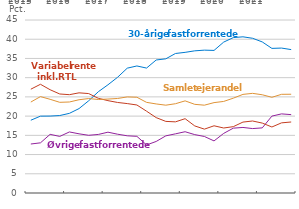
| Category | 30-årige fastforrentede | Øvrige fastforrentede | Variabel rente inkl. RTL | Samlet ejerandel |
|---|---|---|---|---|
| 2015.0 | 18.932 | 12.742 | 27.001 | 23.654 |
| nan | 19.99 | 13.047 | 28.278 | 25.077 |
| nan | 20.009 | 15.256 | 26.861 | 24.373 |
| nan | 20.149 | 14.717 | 25.754 | 23.587 |
| 2016.0 | 20.718 | 15.88 | 25.573 | 23.673 |
| nan | 21.959 | 15.394 | 26.056 | 24.259 |
| nan | 23.988 | 15.008 | 25.863 | 24.568 |
| nan | 26.342 | 15.231 | 24.635 | 24.328 |
| 2017.0 | 28.148 | 15.819 | 24.023 | 24.433 |
| nan | 30.104 | 15.29 | 23.551 | 24.588 |
| nan | 32.472 | 14.876 | 23.257 | 24.995 |
| nan | 33.043 | 14.738 | 22.893 | 24.907 |
| 2018.0 | 32.497 | 12.497 | 21.285 | 23.578 |
| nan | 34.597 | 13.405 | 19.608 | 23.166 |
| nan | 34.903 | 14.865 | 18.626 | 22.844 |
| nan | 36.287 | 15.387 | 18.506 | 23.22 |
| 2019.0 | 36.585 | 15.937 | 19.33 | 23.966 |
| nan | 36.979 | 15.182 | 17.447 | 23.062 |
| nan | 37.16 | 14.703 | 16.611 | 22.843 |
| nan | 37.087 | 13.55 | 17.482 | 23.511 |
| 2020.0 | 39.252 | 15.502 | 16.906 | 23.819 |
| nan | 40.421 | 16.868 | 17.26 | 24.668 |
| nan | 40.627 | 17.051 | 18.445 | 25.652 |
| nan | 40.247 | 16.758 | 18.732 | 25.919 |
| 2021.0 | 39.295 | 16.937 | 18.187 | 25.549 |
| nan | 37.617 | 19.999 | 17.17 | 24.896 |
| nan | 37.697 | 20.578 | 18.247 | 25.669 |
| nan | 37.299 | 20.384 | 18.472 | 25.69 |